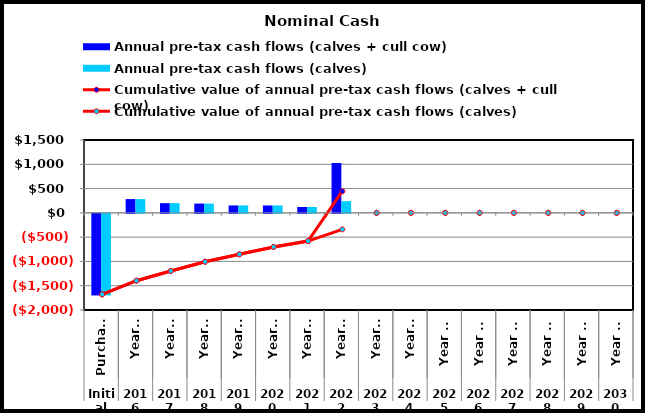
| Category | Annual pre-tax cash flows (calves + cull cow) | Annual pre-tax cash flows (calves) |
|---|---|---|
| 0 | -1680 | -1680 |
| 1 | 283.4 | 283.4 |
| 2 | 199.4 | 199.4 |
| 3 | 190.8 | 190.8 |
| 4 | 152.6 | 152.6 |
| 5 | 152.6 | 152.6 |
| 6 | 120.1 | 120.1 |
| 7 | 1026.95 | 240.95 |
| 8 | 0 | 0 |
| 9 | 0 | 0 |
| 10 | 0 | 0 |
| 11 | 0 | 0 |
| 12 | 0 | 0 |
| 13 | 0 | 0 |
| 14 | 0 | 0 |
| 15 | 0 | 0 |